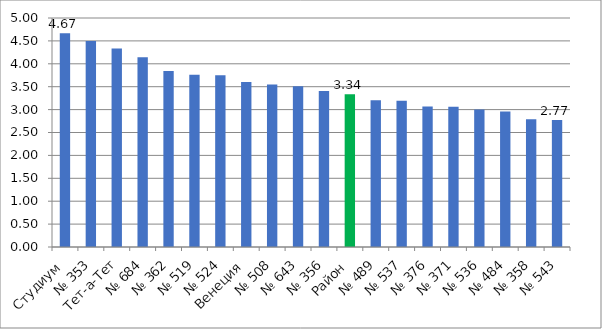
| Category | ОТМЕТКА |
|---|---|
| Студиум | 4.667 |
| № 353 | 4.5 |
| Тет-а-Тет | 4.333 |
| № 684 | 4.143 |
| № 362 | 3.843 |
| № 519 | 3.761 |
| № 524 | 3.75 |
| Венеция | 3.6 |
| № 508 | 3.548 |
| № 643 | 3.51 |
| № 356 | 3.406 |
| Район | 3.337 |
| № 489 | 3.204 |
| № 537 | 3.196 |
| № 376 | 3.068 |
| № 371 | 3.062 |
| № 536 | 3 |
| № 484 | 2.957 |
| № 358 | 2.787 |
| № 543 | 2.774 |